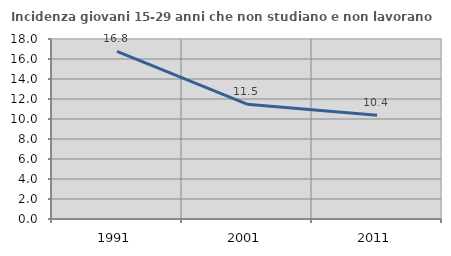
| Category | Incidenza giovani 15-29 anni che non studiano e non lavorano  |
|---|---|
| 1991.0 | 16.766 |
| 2001.0 | 11.486 |
| 2011.0 | 10.377 |